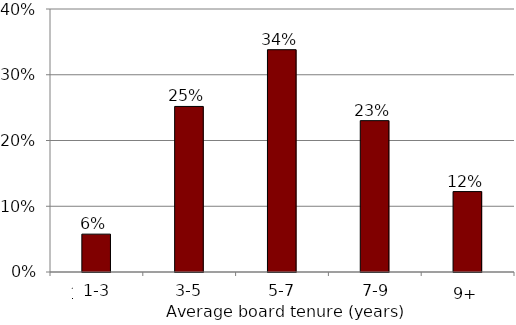
| Category | Series 0 |
|---|---|
| 1 to 3 | 0.058 |
| 3 to 5 | 0.252 |
| 5 to 7 | 0.338 |
| 7 to 9 | 0.23 |
| 9+ | 0.122 |